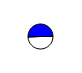
| Category | Series 0 |
|---|---|
| 0 | 4608116 |
| 1 | 4733368 |